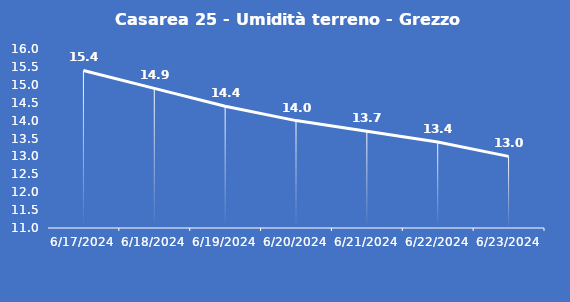
| Category | Casarea 25 - Umidità terreno - Grezzo (%VWC) |
|---|---|
| 6/17/24 | 15.4 |
| 6/18/24 | 14.9 |
| 6/19/24 | 14.4 |
| 6/20/24 | 14 |
| 6/21/24 | 13.7 |
| 6/22/24 | 13.4 |
| 6/23/24 | 13 |